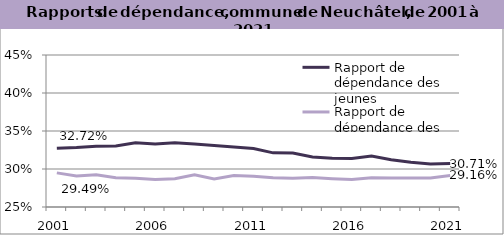
| Category | Rapport de dépendance des jeunes | Rapport de dépendance des personnes âgées |
|---|---|---|
| 2001.0 | 0.327 | 0.295 |
| 2002.0 | 0.328 | 0.291 |
| 2003.0 | 0.33 | 0.292 |
| 2004.0 | 0.33 | 0.289 |
| 2005.0 | 0.335 | 0.288 |
| 2006.0 | 0.333 | 0.286 |
| 2007.0 | 0.334 | 0.287 |
| 2008.0 | 0.333 | 0.292 |
| 2009.0 | 0.331 | 0.287 |
| 2010.0 | 0.329 | 0.291 |
| 2011.0 | 0.327 | 0.291 |
| 2012.0 | 0.321 | 0.289 |
| 2013.0 | 0.321 | 0.288 |
| 2014.0 | 0.316 | 0.289 |
| 2015.0 | 0.314 | 0.287 |
| 2016.0 | 0.314 | 0.286 |
| 2017.0 | 0.317 | 0.288 |
| 2018.0 | 0.312 | 0.288 |
| 2019.0 | 0.309 | 0.288 |
| 2020.0 | 0.306 | 0.288 |
| 2021.0 | 0.307 | 0.292 |